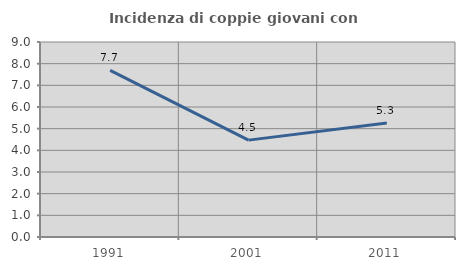
| Category | Incidenza di coppie giovani con figli |
|---|---|
| 1991.0 | 7.692 |
| 2001.0 | 4.472 |
| 2011.0 | 5.263 |